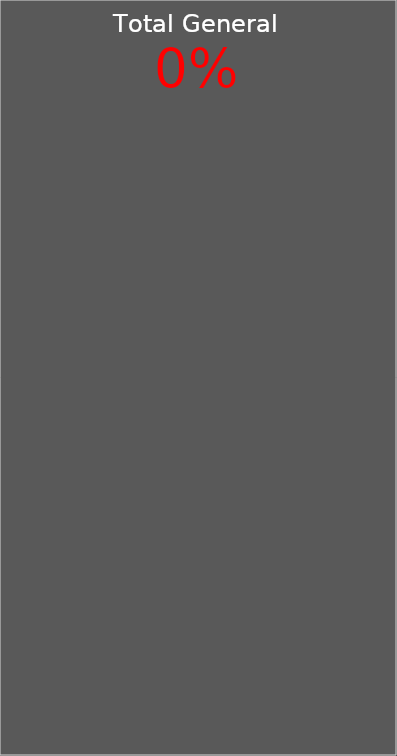
| Category | Series 0 | Series 1 | Series 2 | Series 3 |
|---|---|---|---|---|
| 0 | 0 | 0 | 0 | 1 |